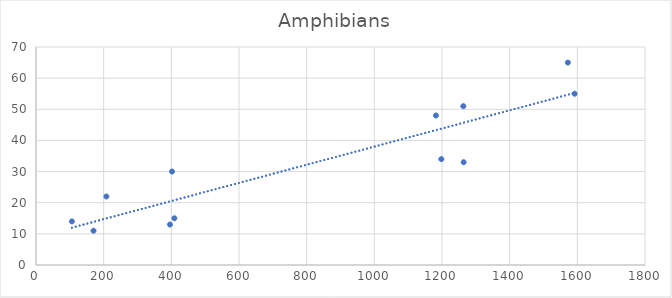
| Category | Amphibians |
|---|---|
| 106.0 | 14 |
| 170.0 | 11 |
| 208.0 | 22 |
| 396.0 | 13 |
| 402.0 | 30 |
| 409.0 | 15 |
| 1182.0 | 48 |
| 1198.0 | 34 |
| 1263.0 | 51 |
| 1264.0 | 33 |
| 1572.0 | 65 |
| 1592.0 | 55 |